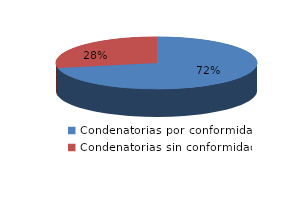
| Category | Series 0 |
|---|---|
| 0 | 1574 |
| 1 | 615 |